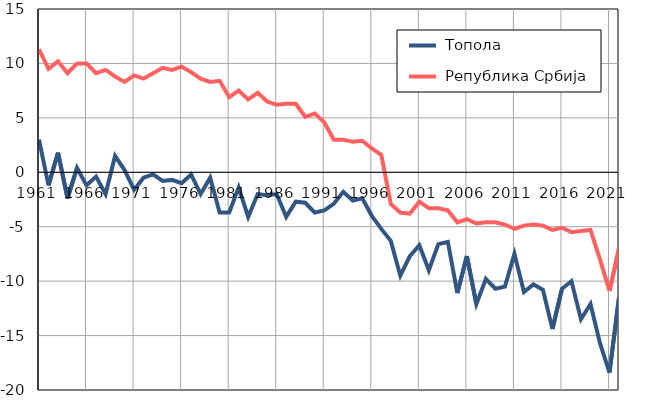
| Category |  Топола |  Република Србија |
|---|---|---|
| 1961.0 | 3 | 11.3 |
| 1962.0 | -1.2 | 9.5 |
| 1963.0 | 1.8 | 10.2 |
| 1964.0 | -2.4 | 9.1 |
| 1965.0 | 0.4 | 10 |
| 1966.0 | -1.2 | 10 |
| 1967.0 | -0.4 | 9.1 |
| 1968.0 | -2 | 9.4 |
| 1969.0 | 1.5 | 8.8 |
| 1970.0 | 0.2 | 8.3 |
| 1971.0 | -1.6 | 8.9 |
| 1972.0 | -0.5 | 8.6 |
| 1973.0 | -0.2 | 9.1 |
| 1974.0 | -0.8 | 9.6 |
| 1975.0 | -0.7 | 9.4 |
| 1976.0 | -1 | 9.7 |
| 1977.0 | -0.2 | 9.2 |
| 1978.0 | -2 | 8.6 |
| 1979.0 | -0.5 | 8.3 |
| 1980.0 | -3.7 | 8.4 |
| 1981.0 | -3.7 | 6.9 |
| 1982.0 | -1.4 | 7.5 |
| 1983.0 | -4.1 | 6.7 |
| 1984.0 | -2 | 7.3 |
| 1985.0 | -2.1 | 6.5 |
| 1986.0 | -2 | 6.2 |
| 1987.0 | -4.1 | 6.3 |
| 1988.0 | -2.7 | 6.3 |
| 1989.0 | -2.8 | 5.1 |
| 1990.0 | -3.7 | 5.4 |
| 1991.0 | -3.5 | 4.6 |
| 1992.0 | -2.9 | 3 |
| 1993.0 | -1.8 | 3 |
| 1994.0 | -2.6 | 2.8 |
| 1995.0 | -2.4 | 2.9 |
| 1996.0 | -4 | 2.2 |
| 1997.0 | -5.2 | 1.6 |
| 1998.0 | -6.3 | -2.9 |
| 1999.0 | -9.5 | -3.7 |
| 2000.0 | -7.7 | -3.8 |
| 2001.0 | -6.7 | -2.7 |
| 2002.0 | -9 | -3.3 |
| 2003.0 | -6.6 | -3.3 |
| 2004.0 | -6.4 | -3.5 |
| 2005.0 | -11.1 | -4.6 |
| 2006.0 | -7.7 | -4.3 |
| 2007.0 | -12.1 | -4.7 |
| 2008.0 | -9.8 | -4.6 |
| 2009.0 | -10.7 | -4.6 |
| 2010.0 | -10.5 | -4.8 |
| 2011.0 | -7.5 | -5.2 |
| 2012.0 | -11 | -4.9 |
| 2013.0 | -10.3 | -4.8 |
| 2014.0 | -10.8 | -4.9 |
| 2015.0 | -14.4 | -5.3 |
| 2016.0 | -10.7 | -5.1 |
| 2017.0 | -10 | -5.5 |
| 2018.0 | -13.5 | -5.4 |
| 2019.0 | -12.1 | -5.3 |
| 2020.0 | -15.7 | -8 |
| 2021.0 | -18.4 | -10.9 |
| 2022.0 | -11.5 | -7 |